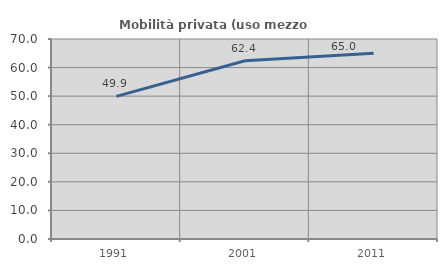
| Category | Mobilità privata (uso mezzo privato) |
|---|---|
| 1991.0 | 49.928 |
| 2001.0 | 62.404 |
| 2011.0 | 64.985 |